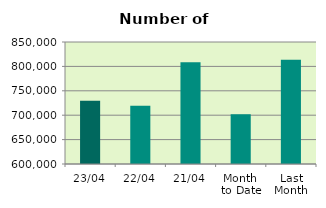
| Category | Series 0 |
|---|---|
| 23/04 | 729480 |
| 22/04 | 719284 |
| 21/04 | 808438 |
| Month 
to Date | 702024.8 |
| Last
Month | 813408 |